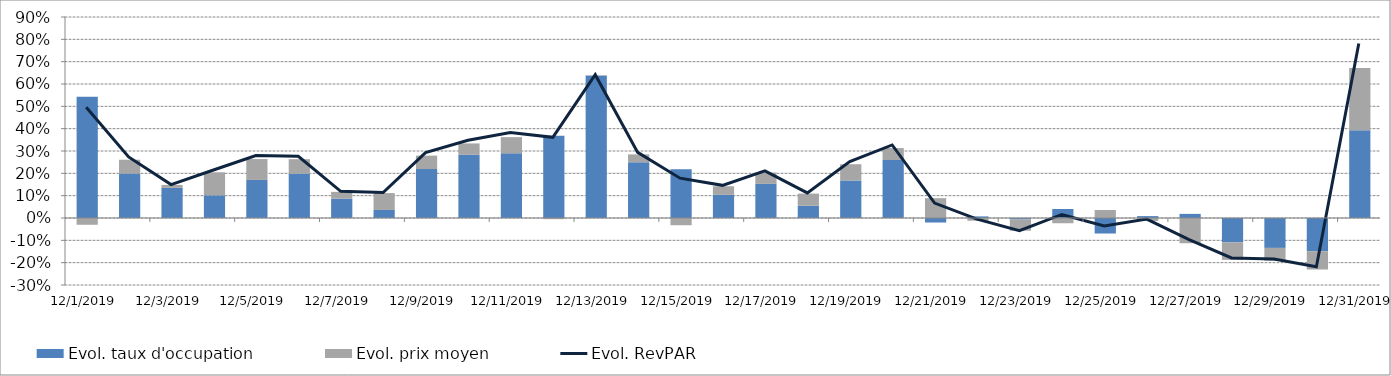
| Category | Evol. taux d'occupation | Evol. prix moyen |
|---|---|---|
| 12/1/19 | 0.543 | -0.03 |
| 12/2/19 | 0.199 | 0.062 |
| 12/3/19 | 0.135 | 0.013 |
| 12/4/19 | 0.101 | 0.103 |
| 12/5/19 | 0.171 | 0.093 |
| 12/6/19 | 0.198 | 0.065 |
| 12/7/19 | 0.086 | 0.031 |
| 12/8/19 | 0.036 | 0.076 |
| 12/9/19 | 0.219 | 0.06 |
| 12/10/19 | 0.283 | 0.051 |
| 12/11/19 | 0.289 | 0.073 |
| 12/12/19 | 0.368 | -0.005 |
| 12/13/19 | 0.637 | 0.003 |
| 12/14/19 | 0.25 | 0.035 |
| 12/15/19 | 0.218 | -0.032 |
| 12/16/19 | 0.104 | 0.038 |
| 12/17/19 | 0.153 | 0.051 |
| 12/18/19 | 0.055 | 0.054 |
| 12/19/19 | 0.168 | 0.073 |
| 12/20/19 | 0.26 | 0.053 |
| 12/21/19 | -0.02 | 0.089 |
| 12/22/19 | 0.007 | -0.012 |
| 12/23/19 | -0.007 | -0.05 |
| 12/24/19 | 0.04 | -0.024 |
| 12/25/19 | -0.069 | 0.036 |
| 12/26/19 | 0.008 | -0.013 |
| 12/27/19 | 0.018 | -0.113 |
| 12/28/19 | -0.109 | -0.079 |
| 12/29/19 | -0.134 | -0.058 |
| 12/30/19 | -0.149 | -0.082 |
| 12/31/19 | 0.392 | 0.279 |